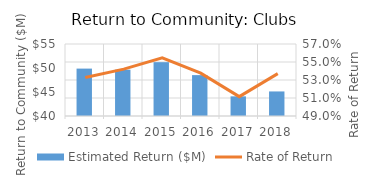
| Category | Estimated Return ($M) |
|---|---|
| 2013 | 49.875 |
| 2014 | 49.648 |
| 2015 | 51.212 |
| 2016 | 48.517 |
| 2017 | 44.092 |
| 2018 | 45.116 |